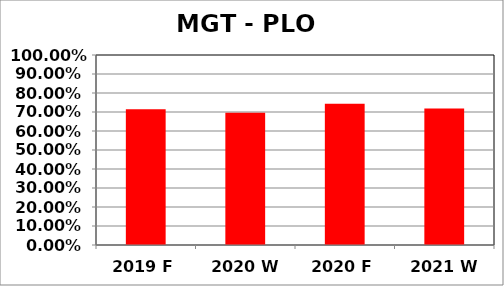
| Category | Series 0 |
|---|---|
| 2019 F | 0.715 |
| 2020 W | 0.696 |
| 2020 F | 0.743 |
| 2021 W | 0.718 |